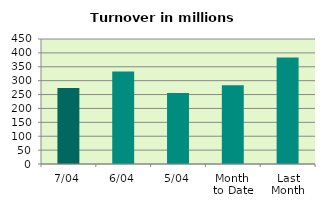
| Category | Series 0 |
|---|---|
| 7/04 | 273.605 |
| 6/04 | 332.855 |
| 5/04 | 255.718 |
| Month 
to Date | 283.734 |
| Last
Month | 383.695 |